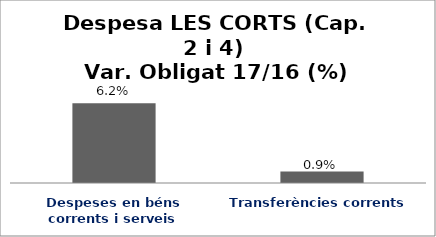
| Category | Series 0 |
|---|---|
| Despeses en béns corrents i serveis | 0.062 |
| Transferències corrents | 0.009 |